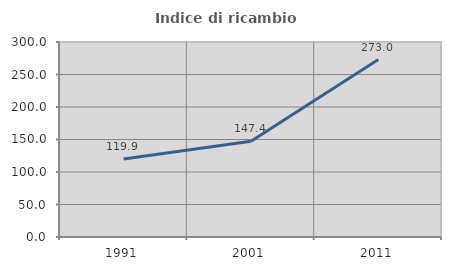
| Category | Indice di ricambio occupazionale  |
|---|---|
| 1991.0 | 119.882 |
| 2001.0 | 147.447 |
| 2011.0 | 272.967 |